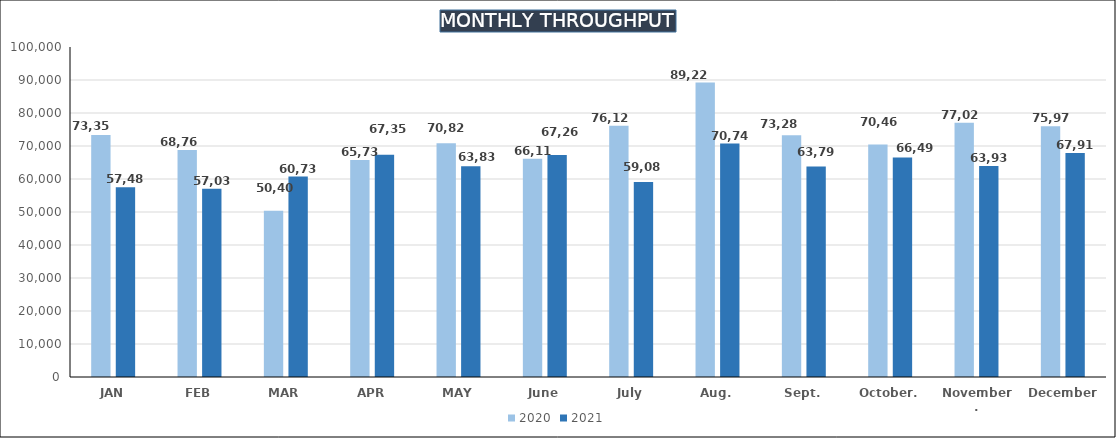
| Category | 2020 | 2021 |
|---|---|---|
| JAN | 73350 | 57487 |
| FEB | 68763 | 57031 |
| MAR | 50403 | 60732 |
| APR | 65731 | 67357 |
| MAY | 70828 | 63835 |
| June | 66115 | 67261 |
| July | 76124 | 59084 |
| Aug. | 89225 | 70741 |
| Sept. | 73282 | 63793 |
| October. | 70462 | 66496 |
| November. | 77024 | 63934 |
| December | 75975 | 67911 |